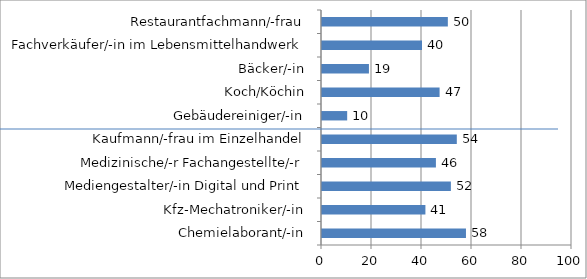
| Category | Series 0 |
|---|---|
| Chemielaborant/-in | 57.586 |
| Kfz-Mechatroniker/-in | 41.365 |
| Mediengestalter/-in Digital und Print | 51.55 |
| Medizinische/-r Fachangestellte/-r | 45.565 |
| Kaufmann/-frau im Einzelhandel | 53.925 |
| Gebäudereiniger/-in | 10.072 |
| Koch/Köchin | 47.038 |
| Bäcker/-in | 18.774 |
| Fachverkäufer/-in im Lebensmittelhandwerk | 40 |
| Restaurantfachmann/-frau | 50.338 |